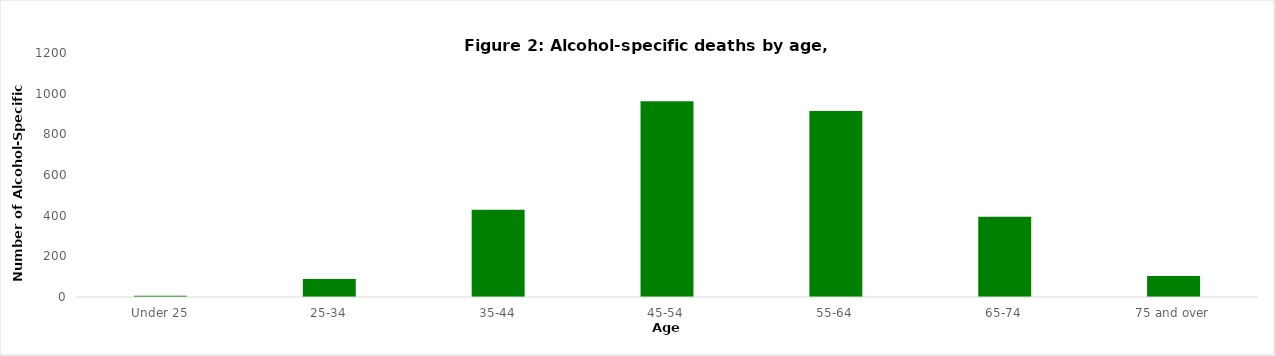
| Category | Series 0 |
|---|---|
| Under 25 | 6 |
| 25-34 | 89 |
| 35-44 | 429 |
| 45-54 | 963 |
| 55-64 | 915 |
| 65-74 | 395 |
| 75 and over | 103 |